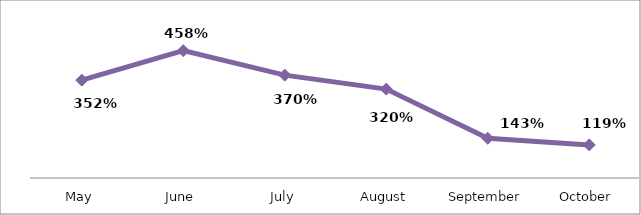
| Category | PERCENTAGE |
|---|---|
| May | 3.52 |
| June | 4.581 |
| July | 3.7 |
| August | 3.197 |
| September | 1.429 |
| October | 1.19 |